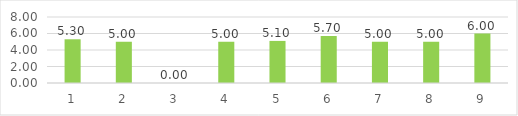
| Category | Series 0 |
|---|---|
| 0 | 5.3 |
| 1 | 5 |
| 2 | 0 |
| 3 | 5 |
| 4 | 5.1 |
| 5 | 5.7 |
| 6 | 5 |
| 7 | 5 |
| 8 | 6 |